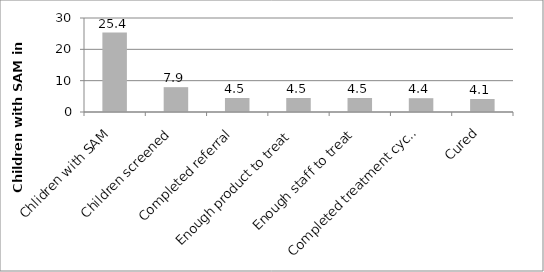
| Category | Series 0 |
|---|---|
| Chlidren with SAM | 25.36 |
| Children screened | 7.925 |
| Completed referral | 4.46 |
| Enough product to treat | 4.46 |
| Enough staff to treat | 4.46 |
| Completed treatment cycle | 4.406 |
| Cured | 4.145 |